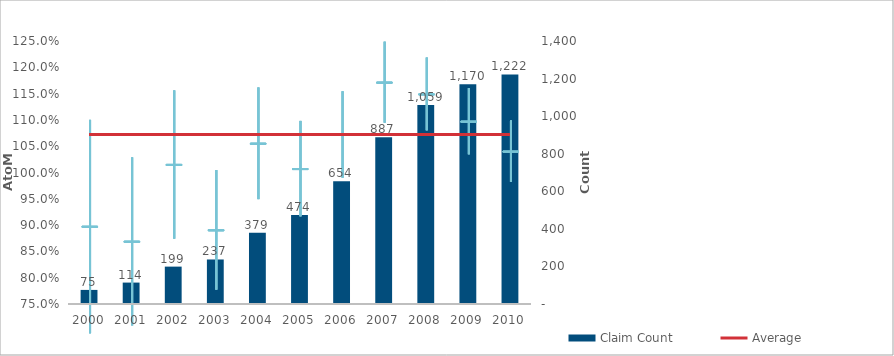
| Category | Claim Count |
|---|---|
| 0 | 75 |
| 1 | 114 |
| 2 | 199 |
| 3 | 237 |
| 4 | 379 |
| 5 | 474 |
| 6 | 654 |
| 7 | 887 |
| 8 | 1059 |
| 9 | 1170 |
| 10 | 1222 |